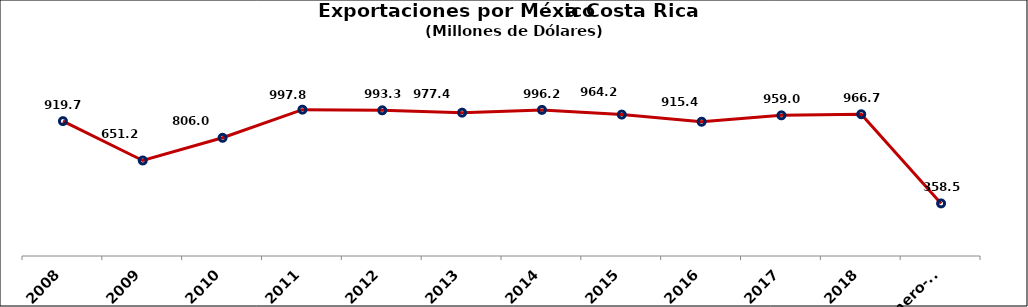
| Category | Series 0 |
|---|---|
| 2008 | 919.721 |
| 2009 | 651.194 |
| 2010 | 805.997 |
| 2011 | 997.824 |
| 2012 | 993.298 |
| 2013 | 977.357 |
| 2014 | 996.231 |
| 2015 | 964.193 |
| 2016 | 915.447 |
| 2017 | 959 |
| 2018 | 966.7 |
| 2019 Enero-Mayo | 358.5 |